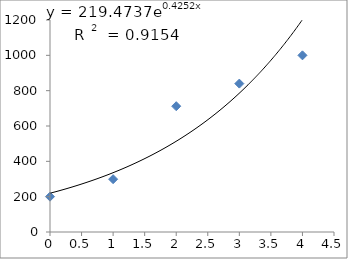
| Category | Series 0 |
|---|---|
| 0.0 | 200 |
| 1.0 | 299 |
| 2.0 | 712 |
| 3.0 | 840 |
| 4.0 | 1000 |